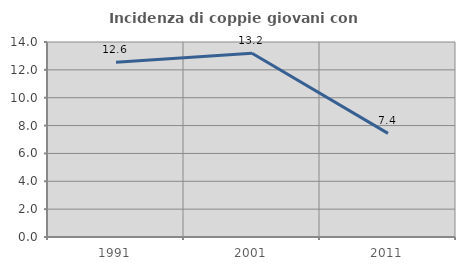
| Category | Incidenza di coppie giovani con figli |
|---|---|
| 1991.0 | 12.551 |
| 2001.0 | 13.191 |
| 2011.0 | 7.439 |